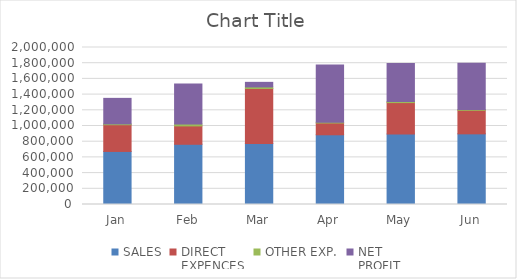
| Category | SALES | DIRECT
EXPENCES | OTHER EXP. | NET
PROFIT |
|---|---|---|---|---|
| Jan | 676000 | 340000 | 11000 | 325000 |
| Feb | 767000 | 234000 | 25000 | 508000 |
| Mar | 778000 | 700000 | 20000 | 58000 |
| Apr | 888000 | 150000 | 11200 | 726800 |
| May | 898000 | 400000 | 15000 | 483000 |
| Jun | 900000 | 300000 | 10000 | 590000 |